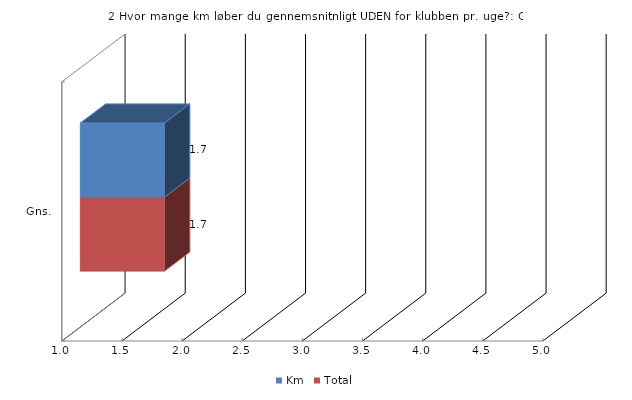
| Category | Km | Total |
|---|---|---|
| Gns. | 1.7 | 1.7 |